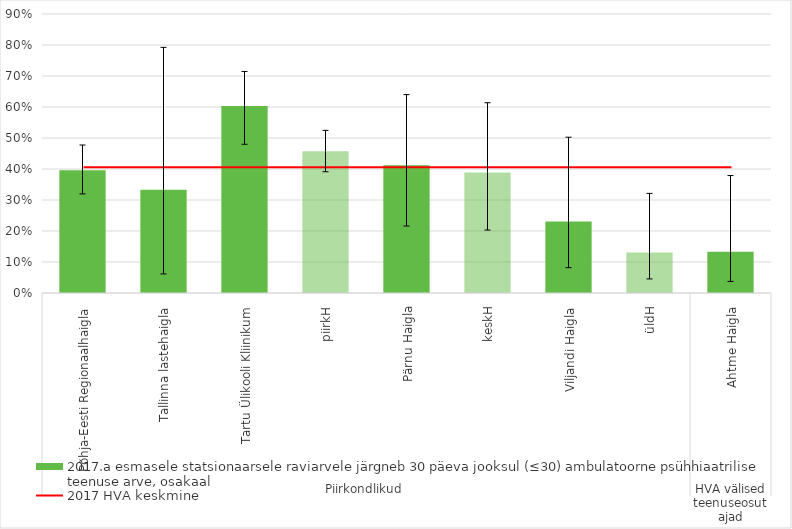
| Category | 2017.a esmasele statsionaarsele raviarvele järgneb 30 päeva jooksul (≤30) ambulatoorne psühhiaatrilise teenuse arve, osakaal |
|---|---|
| 0 | 0.396 |
| 1 | 0.333 |
| 2 | 0.603 |
| 3 | 0.457 |
| 4 | 0.412 |
| 5 | 0.389 |
| 6 | 0.231 |
| 7 | 0.13 |
| 8 | 0.133 |